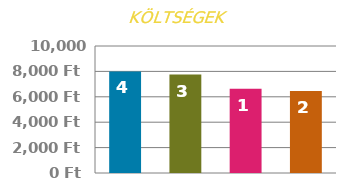
| Category | ELŐZETES |
|---|---|
| 0 | 8000 |
| 1 | 7750 |
| 2 | 6625 |
| 3 | 6450 |